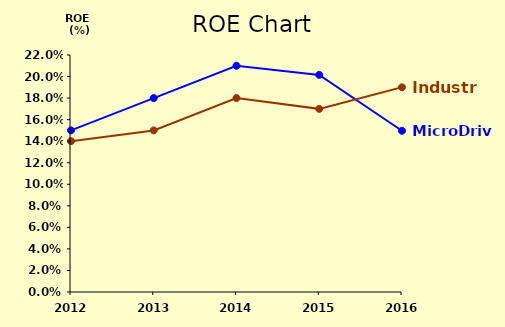
| Category | MicroDrive | Industry |
|---|---|---|
| 2012.0 | 0.15 | 0.14 |
| 2013.0 | 0.18 | 0.15 |
| 2014.0 | 0.21 | 0.18 |
| 2015.0 | 0.202 | 0.17 |
| 2016.0 | 0.15 | 0.19 |